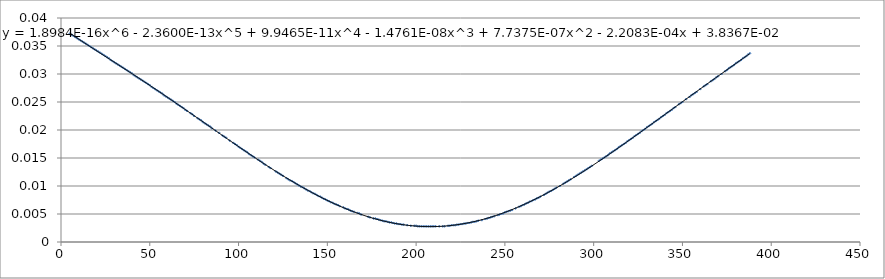
| Category | Series 0 |
|---|---|
| 5.0 | 0.037 |
| 6.0 | 0.037 |
| 7.0 | 0.037 |
| 8.0001 | 0.037 |
| 9.0 | 0.036 |
| 10.0 | 0.036 |
| 11.0 | 0.036 |
| 12.0 | 0.036 |
| 13.0 | 0.036 |
| 14.0 | 0.035 |
| 15.0 | 0.035 |
| 16.0 | 0.035 |
| 17.0 | 0.035 |
| 18.0 | 0.035 |
| 19.0 | 0.034 |
| 20.0 | 0.034 |
| 21.0 | 0.034 |
| 22.0 | 0.034 |
| 23.0 | 0.034 |
| 24.0 | 0.033 |
| 25.0 | 0.033 |
| 26.0 | 0.033 |
| 27.0 | 0.033 |
| 28.0 | 0.032 |
| 29.0 | 0.032 |
| 30.0 | 0.032 |
| 31.0 | 0.032 |
| 32.0 | 0.032 |
| 33.0 | 0.032 |
| 34.0 | 0.031 |
| 35.0 | 0.031 |
| 36.0 | 0.031 |
| 37.0 | 0.031 |
| 38.0 | 0.03 |
| 39.0 | 0.03 |
| 40.0 | 0.03 |
| 41.0 | 0.03 |
| 42.0 | 0.03 |
| 43.0 | 0.029 |
| 44.0 | 0.029 |
| 45.0 | 0.029 |
| 46.0 | 0.029 |
| 47.0 | 0.029 |
| 48.0 | 0.028 |
| 49.0 | 0.028 |
| 50.0 | 0.028 |
| 51.0 | 0.028 |
| 52.0 | 0.028 |
| 53.0 | 0.027 |
| 54.0 | 0.027 |
| 55.0 | 0.027 |
| 56.0 | 0.027 |
| 57.0 | 0.026 |
| 58.0 | 0.026 |
| 59.0 | 0.026 |
| 60.0 | 0.026 |
| 61.0 | 0.026 |
| 62.0 | 0.025 |
| 63.0 | 0.025 |
| 64.0 | 0.025 |
| 65.0 | 0.025 |
| 66.0 | 0.024 |
| 67.0 | 0.024 |
| 68.0 | 0.024 |
| 69.0 | 0.024 |
| 70.0 | 0.024 |
| 71.0 | 0.023 |
| 72.9999 | 0.023 |
| 73.9999 | 0.023 |
| 74.9999 | 0.022 |
| 76.9999 | 0.022 |
| 77.9999 | 0.022 |
| 78.9999 | 0.022 |
| 79.9999 | 0.021 |
| 80.9999 | 0.021 |
| 81.9999 | 0.021 |
| 82.9999 | 0.021 |
| 83.9999 | 0.021 |
| 84.9999 | 0.02 |
| 86.9999 | 0.02 |
| 88.9999 | 0.02 |
| 90.9999 | 0.019 |
| 91.9999 | 0.019 |
| 92.9999 | 0.019 |
| 94.9999 | 0.018 |
| 96.9999 | 0.018 |
| 97.9999 | 0.018 |
| 98.9999 | 0.017 |
| 99.9999 | 0.017 |
| 100.9999 | 0.017 |
| 101.9999 | 0.017 |
| 102.9998 | 0.016 |
| 103.9998 | 0.016 |
| 104.9998 | 0.016 |
| 105.9998 | 0.016 |
| 106.9998 | 0.016 |
| 107.9998 | 0.015 |
| 108.9998 | 0.015 |
| 110.9998 | 0.015 |
| 111.9998 | 0.014 |
| 112.9998 | 0.014 |
| 113.9998 | 0.014 |
| 114.9998 | 0.014 |
| 116.9998 | 0.013 |
| 117.9998 | 0.013 |
| 120.9997 | 0.013 |
| 121.9997 | 0.012 |
| 122.9998 | 0.012 |
| 123.9997 | 0.012 |
| 124.9997 | 0.012 |
| 126.9997 | 0.011 |
| 128.0 | 0.011 |
| 129.0003 | 0.011 |
| 130.0003 | 0.011 |
| 131.0003 | 0.011 |
| 132.0002 | 0.01 |
| 133.0002 | 0.01 |
| 134.0002 | 0.01 |
| 135.0002 | 0.01 |
| 136.0002 | 0.01 |
| 137.0002 | 0.01 |
| 138.0002 | 0.009 |
| 139.0002 | 0.009 |
| 140.0002 | 0.009 |
| 141.0002 | 0.009 |
| 142.0002 | 0.009 |
| 143.0002 | 0.009 |
| 144.0002 | 0.008 |
| 145.0002 | 0.008 |
| 146.0002 | 0.008 |
| 147.0002 | 0.008 |
| 148.0001 | 0.008 |
| 149.0001 | 0.008 |
| 150.0001 | 0.007 |
| 151.0001 | 0.007 |
| 152.0001 | 0.007 |
| 153.0001 | 0.007 |
| 154.0001 | 0.007 |
| 155.0001 | 0.007 |
| 156.0001 | 0.007 |
| 157.0001 | 0.006 |
| 159.0001 | 0.006 |
| 160.0001 | 0.006 |
| 161.0001 | 0.006 |
| 162.0001 | 0.006 |
| 163.0001 | 0.006 |
| 164.0001 | 0.006 |
| 165.0001 | 0.005 |
| 167.0001 | 0.005 |
| 168.0 | 0.005 |
| 169.0 | 0.005 |
| 173.0 | 0.004 |
| 174.0 | 0.004 |
| 176.0 | 0.004 |
| 177.0 | 0.004 |
| 178.0 | 0.004 |
| 179.0 | 0.004 |
| 180.0 | 0.004 |
| 181.0 | 0.004 |
| 182.0 | 0.004 |
| 183.0 | 0.004 |
| 184.0 | 0.004 |
| 185.0 | 0.004 |
| 186.0 | 0.004 |
| 187.0 | 0.003 |
| 188.0 | 0.003 |
| 189.0 | 0.003 |
| 190.0 | 0.003 |
| 191.0 | 0.003 |
| 192.0 | 0.003 |
| 193.0 | 0.003 |
| 194.9999 | 0.003 |
| 196.9999 | 0.003 |
| 198.9999 | 0.003 |
| 199.9999 | 0.003 |
| 200.9999 | 0.003 |
| 201.9999 | 0.003 |
| 202.9999 | 0.003 |
| 203.9999 | 0.003 |
| 204.9999 | 0.003 |
| 205.9999 | 0.003 |
| 206.9999 | 0.003 |
| 207.9999 | 0.003 |
| 208.9999 | 0.003 |
| 209.9999 | 0.003 |
| 211.0 | 0.003 |
| 213.0001 | 0.003 |
| 215.0001 | 0.003 |
| 216.0001 | 0.003 |
| 218.0 | 0.003 |
| 219.0 | 0.003 |
| 220.0 | 0.003 |
| 221.0 | 0.003 |
| 222.0 | 0.003 |
| 223.0 | 0.003 |
| 224.0 | 0.003 |
| 225.0 | 0.003 |
| 226.0 | 0.003 |
| 227.0 | 0.003 |
| 228.0 | 0.003 |
| 229.0 | 0.003 |
| 230.0 | 0.003 |
| 231.0 | 0.004 |
| 232.0 | 0.004 |
| 233.0 | 0.004 |
| 234.0 | 0.004 |
| 235.0 | 0.004 |
| 237.0 | 0.004 |
| 239.0 | 0.004 |
| 240.0 | 0.004 |
| 241.0 | 0.004 |
| 242.0 | 0.004 |
| 243.0 | 0.004 |
| 244.0 | 0.005 |
| 246.0 | 0.005 |
| 247.0 | 0.005 |
| 248.0 | 0.005 |
| 249.0 | 0.005 |
| 250.0 | 0.005 |
| 251.0 | 0.005 |
| 252.0 | 0.006 |
| 253.0 | 0.006 |
| 254.0 | 0.006 |
| 256.0 | 0.006 |
| 258.0 | 0.006 |
| 259.0 | 0.006 |
| 260.0 | 0.007 |
| 261.0 | 0.007 |
| 262.0 | 0.007 |
| 263.0 | 0.007 |
| 264.0 | 0.007 |
| 265.0 | 0.007 |
| 266.0 | 0.008 |
| 267.0 | 0.008 |
| 268.0 | 0.008 |
| 269.0 | 0.008 |
| 270.0 | 0.008 |
| 272.0 | 0.008 |
| 273.0 | 0.009 |
| 274.0 | 0.009 |
| 275.0 | 0.009 |
| 276.0 | 0.009 |
| 277.0 | 0.009 |
| 278.0 | 0.01 |
| 279.0 | 0.01 |
| 281.0 | 0.01 |
| 283.0 | 0.01 |
| 284.0 | 0.011 |
| 285.0 | 0.011 |
| 286.0 | 0.011 |
| 287.0 | 0.011 |
| 289.0 | 0.012 |
| 290.0 | 0.012 |
| 291.0 | 0.012 |
| 292.0 | 0.012 |
| 293.0 | 0.012 |
| 294.0 | 0.013 |
| 295.0 | 0.013 |
| 296.0 | 0.013 |
| 297.0 | 0.013 |
| 298.0 | 0.013 |
| 299.0 | 0.014 |
| 303.0 | 0.014 |
| 304.0 | 0.015 |
| 305.0 | 0.015 |
| 306.0 | 0.015 |
| 307.0 | 0.015 |
| 308.0 | 0.016 |
| 309.0 | 0.016 |
| 310.0 | 0.016 |
| 311.0 | 0.016 |
| 312.0 | 0.016 |
| 313.0 | 0.017 |
| 314.0 | 0.017 |
| 315.0 | 0.017 |
| 316.0 | 0.017 |
| 317.0 | 0.018 |
| 318.0 | 0.018 |
| 319.0 | 0.018 |
| 320.0 | 0.018 |
| 321.0 | 0.018 |
| 322.0 | 0.019 |
| 323.0 | 0.019 |
| 324.0 | 0.019 |
| 325.0 | 0.019 |
| 326.0 | 0.02 |
| 327.0 | 0.02 |
| 328.0 | 0.02 |
| 329.0 | 0.02 |
| 330.0 | 0.02 |
| 331.0 | 0.021 |
| 332.0 | 0.021 |
| 333.0 | 0.021 |
| 334.0 | 0.021 |
| 335.0 | 0.022 |
| 336.0 | 0.022 |
| 337.0 | 0.022 |
| 338.0 | 0.022 |
| 339.0 | 0.022 |
| 340.0 | 0.023 |
| 341.0 | 0.023 |
| 342.0 | 0.023 |
| 343.0 | 0.023 |
| 344.0 | 0.024 |
| 345.0 | 0.024 |
| 346.0 | 0.024 |
| 348.0 | 0.025 |
| 349.0 | 0.025 |
| 350.0 | 0.025 |
| 352.0 | 0.026 |
| 354.0 | 0.026 |
| 355.0 | 0.026 |
| 356.0 | 0.026 |
| 357.0 | 0.027 |
| 358.0 | 0.027 |
| 360.0 | 0.027 |
| 362.0 | 0.028 |
| 363.0 | 0.028 |
| 364.0 | 0.028 |
| 366.0 | 0.029 |
| 367.0 | 0.029 |
| 368.0 | 0.029 |
| 369.0 | 0.029 |
| 370.0 | 0.03 |
| 372.0 | 0.03 |
| 374.0 | 0.03 |
| 375.0 | 0.031 |
| 376.0 | 0.031 |
| 377.0 | 0.031 |
| 378.0 | 0.031 |
| 379.0 | 0.032 |
| 380.0 | 0.032 |
| 381.0 | 0.032 |
| 382.0 | 0.032 |
| 383.0 | 0.032 |
| 384.0 | 0.033 |
| 385.0 | 0.033 |
| 386.0 | 0.033 |
| 387.0 | 0.034 |
| 388.0 | 0.034 |